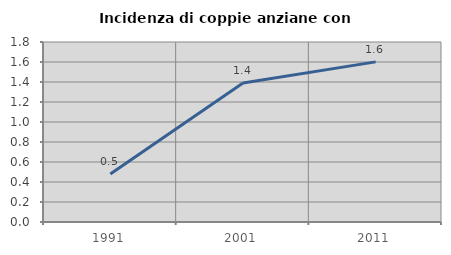
| Category | Incidenza di coppie anziane con figli |
|---|---|
| 1991.0 | 0.479 |
| 2001.0 | 1.39 |
| 2011.0 | 1.601 |